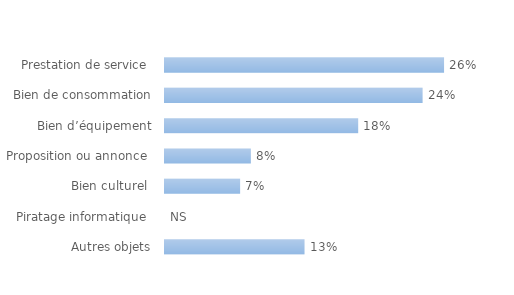
| Category | Fréquence des objets concernés par l'arnaque |
|---|---|
| Autres objets | 0.13 |
| Piratage informatique  | 0 |
| Bien culturel  | 0.07 |
| Proposition ou annonce  | 0.08 |
| Bien d’équipement | 0.18 |
| Bien de consommation | 0.24 |
| Prestation de service  | 0.26 |